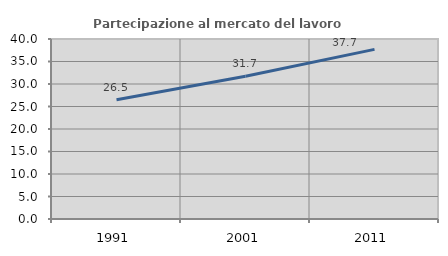
| Category | Partecipazione al mercato del lavoro  femminile |
|---|---|
| 1991.0 | 26.518 |
| 2001.0 | 31.716 |
| 2011.0 | 37.698 |